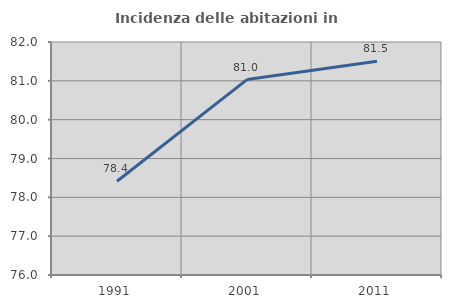
| Category | Incidenza delle abitazioni in proprietà  |
|---|---|
| 1991.0 | 78.413 |
| 2001.0 | 81.032 |
| 2011.0 | 81.506 |